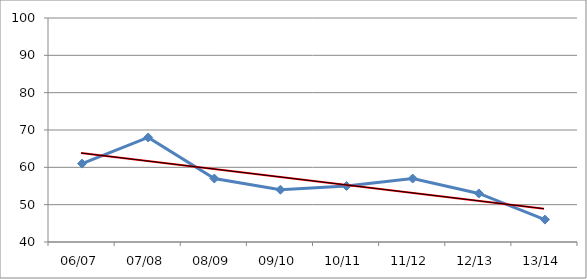
| Category | Series 0 |
|---|---|
| 06/07 | 61 |
| 07/08 | 68 |
| 08/09 | 57 |
| 09/10 | 54 |
| 10/11 | 55 |
| 11/12 | 57 |
| 12/13 | 53 |
| 13/14 | 46 |